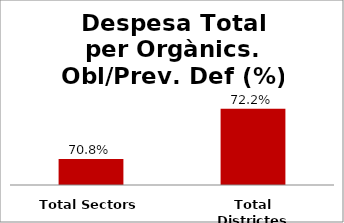
| Category | Series 0 |
|---|---|
| Total Sectors | 0.708 |
| Total Districtes | 0.722 |